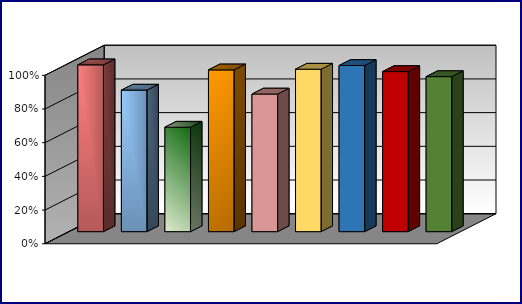
| Category | Series 0 | Series 1 | Series 2 | Series 3 |
|---|---|---|---|---|
| 0 | 0.99 |  |  |  |
| 1 | 0.84 |  |  |  |
| 2 | 0.62 |  |  |  |
| 3 | 0.96 |  |  |  |
| 4 | 0.817 |  |  |  |
| 5 | 0.964 |  |  |  |
| 6 | 0.986 |  |  |  |
| 7 | 0.95 |  |  |  |
| 8 | 0.92 |  |  |  |